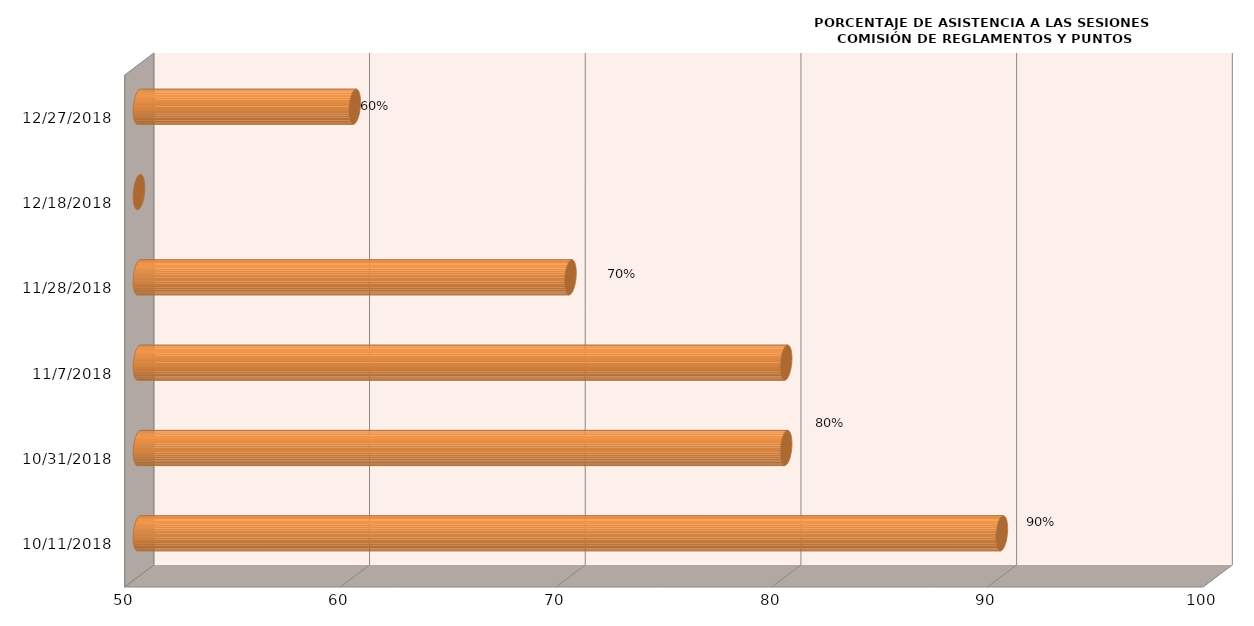
| Category | Series 0 |
|---|---|
| 10/11/18 | 90 |
| 10/31/18 | 80 |
| 11/7/18 | 80 |
| 11/28/18 | 70 |
| 12/18/18 | 0 |
| 12/27/18 | 60 |